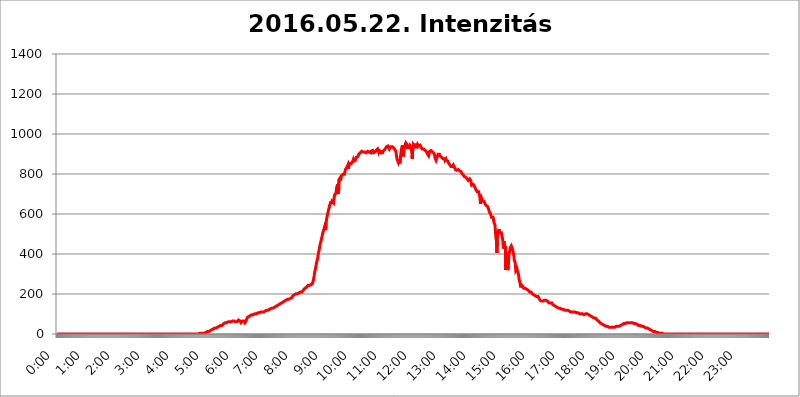
| Category | 2016.05.22. Intenzitás [W/m^2] |
|---|---|
| 0.0 | 0 |
| 0.0006944444444444445 | 0 |
| 0.001388888888888889 | 0 |
| 0.0020833333333333333 | 0 |
| 0.002777777777777778 | 0 |
| 0.003472222222222222 | 0 |
| 0.004166666666666667 | 0 |
| 0.004861111111111111 | 0 |
| 0.005555555555555556 | 0 |
| 0.0062499999999999995 | 0 |
| 0.006944444444444444 | 0 |
| 0.007638888888888889 | 0 |
| 0.008333333333333333 | 0 |
| 0.009027777777777779 | 0 |
| 0.009722222222222222 | 0 |
| 0.010416666666666666 | 0 |
| 0.011111111111111112 | 0 |
| 0.011805555555555555 | 0 |
| 0.012499999999999999 | 0 |
| 0.013194444444444444 | 0 |
| 0.013888888888888888 | 0 |
| 0.014583333333333332 | 0 |
| 0.015277777777777777 | 0 |
| 0.015972222222222224 | 0 |
| 0.016666666666666666 | 0 |
| 0.017361111111111112 | 0 |
| 0.018055555555555557 | 0 |
| 0.01875 | 0 |
| 0.019444444444444445 | 0 |
| 0.02013888888888889 | 0 |
| 0.020833333333333332 | 0 |
| 0.02152777777777778 | 0 |
| 0.022222222222222223 | 0 |
| 0.02291666666666667 | 0 |
| 0.02361111111111111 | 0 |
| 0.024305555555555556 | 0 |
| 0.024999999999999998 | 0 |
| 0.025694444444444447 | 0 |
| 0.02638888888888889 | 0 |
| 0.027083333333333334 | 0 |
| 0.027777777777777776 | 0 |
| 0.02847222222222222 | 0 |
| 0.029166666666666664 | 0 |
| 0.029861111111111113 | 0 |
| 0.030555555555555555 | 0 |
| 0.03125 | 0 |
| 0.03194444444444445 | 0 |
| 0.03263888888888889 | 0 |
| 0.03333333333333333 | 0 |
| 0.034027777777777775 | 0 |
| 0.034722222222222224 | 0 |
| 0.035416666666666666 | 0 |
| 0.036111111111111115 | 0 |
| 0.03680555555555556 | 0 |
| 0.0375 | 0 |
| 0.03819444444444444 | 0 |
| 0.03888888888888889 | 0 |
| 0.03958333333333333 | 0 |
| 0.04027777777777778 | 0 |
| 0.04097222222222222 | 0 |
| 0.041666666666666664 | 0 |
| 0.042361111111111106 | 0 |
| 0.04305555555555556 | 0 |
| 0.043750000000000004 | 0 |
| 0.044444444444444446 | 0 |
| 0.04513888888888889 | 0 |
| 0.04583333333333334 | 0 |
| 0.04652777777777778 | 0 |
| 0.04722222222222222 | 0 |
| 0.04791666666666666 | 0 |
| 0.04861111111111111 | 0 |
| 0.049305555555555554 | 0 |
| 0.049999999999999996 | 0 |
| 0.05069444444444445 | 0 |
| 0.051388888888888894 | 0 |
| 0.052083333333333336 | 0 |
| 0.05277777777777778 | 0 |
| 0.05347222222222222 | 0 |
| 0.05416666666666667 | 0 |
| 0.05486111111111111 | 0 |
| 0.05555555555555555 | 0 |
| 0.05625 | 0 |
| 0.05694444444444444 | 0 |
| 0.057638888888888885 | 0 |
| 0.05833333333333333 | 0 |
| 0.05902777777777778 | 0 |
| 0.059722222222222225 | 0 |
| 0.06041666666666667 | 0 |
| 0.061111111111111116 | 0 |
| 0.06180555555555556 | 0 |
| 0.0625 | 0 |
| 0.06319444444444444 | 0 |
| 0.06388888888888888 | 0 |
| 0.06458333333333334 | 0 |
| 0.06527777777777778 | 0 |
| 0.06597222222222222 | 0 |
| 0.06666666666666667 | 0 |
| 0.06736111111111111 | 0 |
| 0.06805555555555555 | 0 |
| 0.06874999999999999 | 0 |
| 0.06944444444444443 | 0 |
| 0.07013888888888889 | 0 |
| 0.07083333333333333 | 0 |
| 0.07152777777777779 | 0 |
| 0.07222222222222223 | 0 |
| 0.07291666666666667 | 0 |
| 0.07361111111111111 | 0 |
| 0.07430555555555556 | 0 |
| 0.075 | 0 |
| 0.07569444444444444 | 0 |
| 0.0763888888888889 | 0 |
| 0.07708333333333334 | 0 |
| 0.07777777777777778 | 0 |
| 0.07847222222222222 | 0 |
| 0.07916666666666666 | 0 |
| 0.0798611111111111 | 0 |
| 0.08055555555555556 | 0 |
| 0.08125 | 0 |
| 0.08194444444444444 | 0 |
| 0.08263888888888889 | 0 |
| 0.08333333333333333 | 0 |
| 0.08402777777777777 | 0 |
| 0.08472222222222221 | 0 |
| 0.08541666666666665 | 0 |
| 0.08611111111111112 | 0 |
| 0.08680555555555557 | 0 |
| 0.08750000000000001 | 0 |
| 0.08819444444444445 | 0 |
| 0.08888888888888889 | 0 |
| 0.08958333333333333 | 0 |
| 0.09027777777777778 | 0 |
| 0.09097222222222222 | 0 |
| 0.09166666666666667 | 0 |
| 0.09236111111111112 | 0 |
| 0.09305555555555556 | 0 |
| 0.09375 | 0 |
| 0.09444444444444444 | 0 |
| 0.09513888888888888 | 0 |
| 0.09583333333333333 | 0 |
| 0.09652777777777777 | 0 |
| 0.09722222222222222 | 0 |
| 0.09791666666666667 | 0 |
| 0.09861111111111111 | 0 |
| 0.09930555555555555 | 0 |
| 0.09999999999999999 | 0 |
| 0.10069444444444443 | 0 |
| 0.1013888888888889 | 0 |
| 0.10208333333333335 | 0 |
| 0.10277777777777779 | 0 |
| 0.10347222222222223 | 0 |
| 0.10416666666666667 | 0 |
| 0.10486111111111111 | 0 |
| 0.10555555555555556 | 0 |
| 0.10625 | 0 |
| 0.10694444444444444 | 0 |
| 0.1076388888888889 | 0 |
| 0.10833333333333334 | 0 |
| 0.10902777777777778 | 0 |
| 0.10972222222222222 | 0 |
| 0.1111111111111111 | 0 |
| 0.11180555555555556 | 0 |
| 0.11180555555555556 | 0 |
| 0.1125 | 0 |
| 0.11319444444444444 | 0 |
| 0.11388888888888889 | 0 |
| 0.11458333333333333 | 0 |
| 0.11527777777777777 | 0 |
| 0.11597222222222221 | 0 |
| 0.11666666666666665 | 0 |
| 0.1173611111111111 | 0 |
| 0.11805555555555557 | 0 |
| 0.11944444444444445 | 0 |
| 0.12013888888888889 | 0 |
| 0.12083333333333333 | 0 |
| 0.12152777777777778 | 0 |
| 0.12222222222222223 | 0 |
| 0.12291666666666667 | 0 |
| 0.12291666666666667 | 0 |
| 0.12361111111111112 | 0 |
| 0.12430555555555556 | 0 |
| 0.125 | 0 |
| 0.12569444444444444 | 0 |
| 0.12638888888888888 | 0 |
| 0.12708333333333333 | 0 |
| 0.16875 | 0 |
| 0.12847222222222224 | 0 |
| 0.12916666666666668 | 0 |
| 0.12986111111111112 | 0 |
| 0.13055555555555556 | 0 |
| 0.13125 | 0 |
| 0.13194444444444445 | 0 |
| 0.1326388888888889 | 0 |
| 0.13333333333333333 | 0 |
| 0.13402777777777777 | 0 |
| 0.13402777777777777 | 0 |
| 0.13472222222222222 | 0 |
| 0.13541666666666666 | 0 |
| 0.1361111111111111 | 0 |
| 0.13749999999999998 | 0 |
| 0.13819444444444443 | 0 |
| 0.1388888888888889 | 0 |
| 0.13958333333333334 | 0 |
| 0.14027777777777778 | 0 |
| 0.14097222222222222 | 0 |
| 0.14166666666666666 | 0 |
| 0.1423611111111111 | 0 |
| 0.14305555555555557 | 0 |
| 0.14375000000000002 | 0 |
| 0.14444444444444446 | 0 |
| 0.1451388888888889 | 0 |
| 0.1451388888888889 | 0 |
| 0.14652777777777778 | 0 |
| 0.14722222222222223 | 0 |
| 0.14791666666666667 | 0 |
| 0.1486111111111111 | 0 |
| 0.14930555555555555 | 0 |
| 0.15 | 0 |
| 0.15069444444444444 | 0 |
| 0.15138888888888888 | 0 |
| 0.15208333333333332 | 0 |
| 0.15277777777777776 | 0 |
| 0.15347222222222223 | 0 |
| 0.15416666666666667 | 0 |
| 0.15486111111111112 | 0 |
| 0.15555555555555556 | 0 |
| 0.15625 | 0 |
| 0.15694444444444444 | 0 |
| 0.15763888888888888 | 0 |
| 0.15833333333333333 | 0 |
| 0.15902777777777777 | 0 |
| 0.15972222222222224 | 0 |
| 0.16041666666666668 | 0 |
| 0.16111111111111112 | 0 |
| 0.16180555555555556 | 0 |
| 0.1625 | 0 |
| 0.16319444444444445 | 0 |
| 0.1638888888888889 | 0 |
| 0.16458333333333333 | 0 |
| 0.16527777777777777 | 0 |
| 0.16597222222222222 | 0 |
| 0.16666666666666666 | 0 |
| 0.1673611111111111 | 0 |
| 0.16805555555555554 | 0 |
| 0.16874999999999998 | 0 |
| 0.16944444444444443 | 0 |
| 0.17013888888888887 | 0 |
| 0.1708333333333333 | 0 |
| 0.17152777777777775 | 0 |
| 0.17222222222222225 | 0 |
| 0.1729166666666667 | 0 |
| 0.17361111111111113 | 0 |
| 0.17430555555555557 | 0 |
| 0.17500000000000002 | 0 |
| 0.17569444444444446 | 0 |
| 0.1763888888888889 | 0 |
| 0.17708333333333334 | 0 |
| 0.17777777777777778 | 0 |
| 0.17847222222222223 | 0 |
| 0.17916666666666667 | 0 |
| 0.1798611111111111 | 0 |
| 0.18055555555555555 | 0 |
| 0.18125 | 0 |
| 0.18194444444444444 | 0 |
| 0.1826388888888889 | 0 |
| 0.18333333333333335 | 0 |
| 0.1840277777777778 | 0 |
| 0.18472222222222223 | 0 |
| 0.18541666666666667 | 0 |
| 0.18611111111111112 | 0 |
| 0.18680555555555556 | 0 |
| 0.1875 | 0 |
| 0.18819444444444444 | 0 |
| 0.18888888888888888 | 0 |
| 0.18958333333333333 | 0 |
| 0.19027777777777777 | 0 |
| 0.1909722222222222 | 0 |
| 0.19166666666666665 | 0 |
| 0.19236111111111112 | 0 |
| 0.19305555555555554 | 0 |
| 0.19375 | 0 |
| 0.19444444444444445 | 0 |
| 0.1951388888888889 | 0 |
| 0.19583333333333333 | 0 |
| 0.19652777777777777 | 0 |
| 0.19722222222222222 | 0 |
| 0.19791666666666666 | 0 |
| 0.1986111111111111 | 0 |
| 0.19930555555555554 | 0 |
| 0.19999999999999998 | 3.525 |
| 0.20069444444444443 | 3.525 |
| 0.20138888888888887 | 3.525 |
| 0.2020833333333333 | 3.525 |
| 0.2027777777777778 | 3.525 |
| 0.2034722222222222 | 3.525 |
| 0.2041666666666667 | 3.525 |
| 0.20486111111111113 | 3.525 |
| 0.20555555555555557 | 3.525 |
| 0.20625000000000002 | 3.525 |
| 0.20694444444444446 | 7.887 |
| 0.2076388888888889 | 7.887 |
| 0.20833333333333334 | 7.887 |
| 0.20902777777777778 | 7.887 |
| 0.20972222222222223 | 12.257 |
| 0.21041666666666667 | 12.257 |
| 0.2111111111111111 | 12.257 |
| 0.21180555555555555 | 12.257 |
| 0.2125 | 12.257 |
| 0.21319444444444444 | 16.636 |
| 0.2138888888888889 | 16.636 |
| 0.21458333333333335 | 16.636 |
| 0.2152777777777778 | 16.636 |
| 0.21597222222222223 | 21.024 |
| 0.21666666666666667 | 21.024 |
| 0.21736111111111112 | 21.024 |
| 0.21805555555555556 | 21.024 |
| 0.21875 | 25.419 |
| 0.21944444444444444 | 25.419 |
| 0.22013888888888888 | 25.419 |
| 0.22083333333333333 | 29.823 |
| 0.22152777777777777 | 29.823 |
| 0.2222222222222222 | 29.823 |
| 0.22291666666666665 | 29.823 |
| 0.2236111111111111 | 29.823 |
| 0.22430555555555556 | 34.234 |
| 0.225 | 34.234 |
| 0.22569444444444445 | 34.234 |
| 0.2263888888888889 | 38.653 |
| 0.22708333333333333 | 38.653 |
| 0.22777777777777777 | 38.653 |
| 0.22847222222222222 | 38.653 |
| 0.22916666666666666 | 43.079 |
| 0.2298611111111111 | 43.079 |
| 0.23055555555555554 | 43.079 |
| 0.23124999999999998 | 43.079 |
| 0.23194444444444443 | 47.511 |
| 0.23263888888888887 | 47.511 |
| 0.2333333333333333 | 51.951 |
| 0.2340277777777778 | 51.951 |
| 0.2347222222222222 | 51.951 |
| 0.2354166666666667 | 56.398 |
| 0.23611111111111113 | 56.398 |
| 0.23680555555555557 | 56.398 |
| 0.23750000000000002 | 56.398 |
| 0.23819444444444446 | 56.398 |
| 0.2388888888888889 | 60.85 |
| 0.23958333333333334 | 60.85 |
| 0.24027777777777778 | 60.85 |
| 0.24097222222222223 | 60.85 |
| 0.24166666666666667 | 60.85 |
| 0.2423611111111111 | 60.85 |
| 0.24305555555555555 | 60.85 |
| 0.24375 | 60.85 |
| 0.24444444444444446 | 65.31 |
| 0.24513888888888888 | 65.31 |
| 0.24583333333333335 | 65.31 |
| 0.2465277777777778 | 65.31 |
| 0.24722222222222223 | 65.31 |
| 0.24791666666666667 | 65.31 |
| 0.24861111111111112 | 60.85 |
| 0.24930555555555556 | 60.85 |
| 0.25 | 60.85 |
| 0.25069444444444444 | 60.85 |
| 0.2513888888888889 | 60.85 |
| 0.2520833333333333 | 60.85 |
| 0.25277777777777777 | 56.398 |
| 0.2534722222222222 | 65.31 |
| 0.25416666666666665 | 69.775 |
| 0.2548611111111111 | 69.775 |
| 0.2555555555555556 | 69.775 |
| 0.25625000000000003 | 65.31 |
| 0.2569444444444445 | 65.31 |
| 0.2576388888888889 | 56.398 |
| 0.25833333333333336 | 60.85 |
| 0.2590277777777778 | 60.85 |
| 0.25972222222222224 | 65.31 |
| 0.2604166666666667 | 60.85 |
| 0.2611111111111111 | 65.31 |
| 0.26180555555555557 | 65.31 |
| 0.2625 | 60.85 |
| 0.26319444444444445 | 56.398 |
| 0.2638888888888889 | 56.398 |
| 0.26458333333333334 | 60.85 |
| 0.2652777777777778 | 69.775 |
| 0.2659722222222222 | 74.246 |
| 0.26666666666666666 | 83.205 |
| 0.2673611111111111 | 83.205 |
| 0.26805555555555555 | 87.692 |
| 0.26875 | 87.692 |
| 0.26944444444444443 | 87.692 |
| 0.2701388888888889 | 92.184 |
| 0.2708333333333333 | 92.184 |
| 0.27152777777777776 | 92.184 |
| 0.2722222222222222 | 92.184 |
| 0.27291666666666664 | 96.682 |
| 0.2736111111111111 | 96.682 |
| 0.2743055555555555 | 96.682 |
| 0.27499999999999997 | 96.682 |
| 0.27569444444444446 | 101.184 |
| 0.27638888888888885 | 101.184 |
| 0.27708333333333335 | 101.184 |
| 0.2777777777777778 | 101.184 |
| 0.27847222222222223 | 101.184 |
| 0.2791666666666667 | 101.184 |
| 0.2798611111111111 | 105.69 |
| 0.28055555555555556 | 105.69 |
| 0.28125 | 105.69 |
| 0.28194444444444444 | 105.69 |
| 0.2826388888888889 | 105.69 |
| 0.2833333333333333 | 105.69 |
| 0.28402777777777777 | 110.201 |
| 0.2847222222222222 | 110.201 |
| 0.28541666666666665 | 110.201 |
| 0.28611111111111115 | 110.201 |
| 0.28680555555555554 | 110.201 |
| 0.28750000000000003 | 110.201 |
| 0.2881944444444445 | 110.201 |
| 0.2888888888888889 | 110.201 |
| 0.28958333333333336 | 110.201 |
| 0.2902777777777778 | 114.716 |
| 0.29097222222222224 | 114.716 |
| 0.2916666666666667 | 114.716 |
| 0.2923611111111111 | 114.716 |
| 0.29305555555555557 | 119.235 |
| 0.29375 | 119.235 |
| 0.29444444444444445 | 119.235 |
| 0.2951388888888889 | 119.235 |
| 0.29583333333333334 | 119.235 |
| 0.2965277777777778 | 119.235 |
| 0.2972222222222222 | 119.235 |
| 0.29791666666666666 | 123.758 |
| 0.2986111111111111 | 123.758 |
| 0.29930555555555555 | 123.758 |
| 0.3 | 128.284 |
| 0.30069444444444443 | 128.284 |
| 0.3013888888888889 | 128.284 |
| 0.3020833333333333 | 128.284 |
| 0.30277777777777776 | 128.284 |
| 0.3034722222222222 | 132.814 |
| 0.30416666666666664 | 132.814 |
| 0.3048611111111111 | 132.814 |
| 0.3055555555555555 | 137.347 |
| 0.30624999999999997 | 137.347 |
| 0.3069444444444444 | 141.884 |
| 0.3076388888888889 | 141.884 |
| 0.30833333333333335 | 141.884 |
| 0.3090277777777778 | 146.423 |
| 0.30972222222222223 | 146.423 |
| 0.3104166666666667 | 146.423 |
| 0.3111111111111111 | 150.964 |
| 0.31180555555555556 | 150.964 |
| 0.3125 | 150.964 |
| 0.31319444444444444 | 155.509 |
| 0.3138888888888889 | 155.509 |
| 0.3145833333333333 | 155.509 |
| 0.31527777777777777 | 155.509 |
| 0.3159722222222222 | 160.056 |
| 0.31666666666666665 | 160.056 |
| 0.31736111111111115 | 164.605 |
| 0.31805555555555554 | 164.605 |
| 0.31875000000000003 | 164.605 |
| 0.3194444444444445 | 164.605 |
| 0.3201388888888889 | 164.605 |
| 0.32083333333333336 | 169.156 |
| 0.3215277777777778 | 169.156 |
| 0.32222222222222224 | 173.709 |
| 0.3229166666666667 | 173.709 |
| 0.3236111111111111 | 173.709 |
| 0.32430555555555557 | 173.709 |
| 0.325 | 173.709 |
| 0.32569444444444445 | 178.264 |
| 0.3263888888888889 | 178.264 |
| 0.32708333333333334 | 178.264 |
| 0.3277777777777778 | 182.82 |
| 0.3284722222222222 | 182.82 |
| 0.32916666666666666 | 182.82 |
| 0.3298611111111111 | 187.378 |
| 0.33055555555555555 | 191.937 |
| 0.33125 | 191.937 |
| 0.33194444444444443 | 196.497 |
| 0.3326388888888889 | 196.497 |
| 0.3333333333333333 | 201.058 |
| 0.3340277777777778 | 201.058 |
| 0.3347222222222222 | 201.058 |
| 0.3354166666666667 | 201.058 |
| 0.3361111111111111 | 205.62 |
| 0.3368055555555556 | 201.058 |
| 0.33749999999999997 | 205.62 |
| 0.33819444444444446 | 205.62 |
| 0.33888888888888885 | 205.62 |
| 0.33958333333333335 | 210.182 |
| 0.34027777777777773 | 210.182 |
| 0.34097222222222223 | 210.182 |
| 0.3416666666666666 | 210.182 |
| 0.3423611111111111 | 210.182 |
| 0.3430555555555555 | 210.182 |
| 0.34375 | 210.182 |
| 0.3444444444444445 | 214.746 |
| 0.3451388888888889 | 219.309 |
| 0.3458333333333334 | 223.873 |
| 0.34652777777777777 | 223.873 |
| 0.34722222222222227 | 228.436 |
| 0.34791666666666665 | 228.436 |
| 0.34861111111111115 | 233 |
| 0.34930555555555554 | 233 |
| 0.35000000000000003 | 237.564 |
| 0.3506944444444444 | 237.564 |
| 0.3513888888888889 | 242.127 |
| 0.3520833333333333 | 242.127 |
| 0.3527777777777778 | 242.127 |
| 0.3534722222222222 | 242.127 |
| 0.3541666666666667 | 246.689 |
| 0.3548611111111111 | 246.689 |
| 0.35555555555555557 | 246.689 |
| 0.35625 | 246.689 |
| 0.35694444444444445 | 251.251 |
| 0.3576388888888889 | 251.251 |
| 0.35833333333333334 | 255.813 |
| 0.3590277777777778 | 264.932 |
| 0.3597222222222222 | 278.603 |
| 0.36041666666666666 | 292.259 |
| 0.3611111111111111 | 310.44 |
| 0.36180555555555555 | 319.517 |
| 0.3625 | 333.113 |
| 0.36319444444444443 | 346.682 |
| 0.3638888888888889 | 360.221 |
| 0.3645833333333333 | 369.23 |
| 0.3652777777777778 | 378.224 |
| 0.3659722222222222 | 396.164 |
| 0.3666666666666667 | 409.574 |
| 0.3673611111111111 | 422.943 |
| 0.3680555555555556 | 436.27 |
| 0.36874999999999997 | 449.551 |
| 0.36944444444444446 | 458.38 |
| 0.37013888888888885 | 467.187 |
| 0.37083333333333335 | 480.356 |
| 0.37152777777777773 | 489.108 |
| 0.37222222222222223 | 502.192 |
| 0.3729166666666666 | 510.885 |
| 0.3736111111111111 | 519.555 |
| 0.3743055555555555 | 523.88 |
| 0.375 | 536.82 |
| 0.3756944444444445 | 528.2 |
| 0.3763888888888889 | 519.555 |
| 0.3770833333333334 | 553.986 |
| 0.37777777777777777 | 575.299 |
| 0.37847222222222227 | 588.009 |
| 0.37916666666666665 | 600.661 |
| 0.37986111111111115 | 609.062 |
| 0.38055555555555554 | 621.613 |
| 0.38125000000000003 | 629.948 |
| 0.3819444444444444 | 642.4 |
| 0.3826388888888889 | 646.537 |
| 0.3833333333333333 | 654.791 |
| 0.3840277777777778 | 663.019 |
| 0.3847222222222222 | 650.667 |
| 0.3854166666666667 | 663.019 |
| 0.3861111111111111 | 658.909 |
| 0.38680555555555557 | 658.909 |
| 0.3875 | 654.791 |
| 0.38819444444444445 | 675.311 |
| 0.3888888888888889 | 695.666 |
| 0.38958333333333334 | 691.608 |
| 0.3902777777777778 | 695.666 |
| 0.3909722222222222 | 703.762 |
| 0.39166666666666666 | 727.896 |
| 0.3923611111111111 | 727.896 |
| 0.39305555555555555 | 747.834 |
| 0.39375 | 747.834 |
| 0.39444444444444443 | 699.717 |
| 0.3951388888888889 | 771.559 |
| 0.3958333333333333 | 767.62 |
| 0.3965277777777778 | 779.42 |
| 0.3972222222222222 | 767.62 |
| 0.3979166666666667 | 779.42 |
| 0.3986111111111111 | 791.169 |
| 0.3993055555555556 | 791.169 |
| 0.39999999999999997 | 795.074 |
| 0.40069444444444446 | 798.974 |
| 0.40138888888888885 | 802.868 |
| 0.40208333333333335 | 802.868 |
| 0.40277777777777773 | 798.974 |
| 0.40347222222222223 | 810.641 |
| 0.4041666666666666 | 822.26 |
| 0.4048611111111111 | 822.26 |
| 0.4055555555555555 | 818.392 |
| 0.40625 | 833.834 |
| 0.4069444444444445 | 833.834 |
| 0.4076388888888889 | 845.365 |
| 0.4083333333333334 | 826.123 |
| 0.40902777777777777 | 845.365 |
| 0.40972222222222227 | 845.365 |
| 0.41041666666666665 | 853.029 |
| 0.41111111111111115 | 856.855 |
| 0.41180555555555554 | 853.029 |
| 0.41250000000000003 | 853.029 |
| 0.4131944444444444 | 853.029 |
| 0.4138888888888889 | 856.855 |
| 0.4145833333333333 | 864.493 |
| 0.4152777777777778 | 872.114 |
| 0.4159722222222222 | 864.493 |
| 0.4166666666666667 | 864.493 |
| 0.4173611111111111 | 864.493 |
| 0.41805555555555557 | 868.305 |
| 0.41875 | 875.918 |
| 0.41944444444444445 | 883.516 |
| 0.4201388888888889 | 879.719 |
| 0.42083333333333334 | 887.309 |
| 0.4215277777777778 | 887.309 |
| 0.4222222222222222 | 891.099 |
| 0.42291666666666666 | 898.668 |
| 0.4236111111111111 | 898.668 |
| 0.42430555555555555 | 898.668 |
| 0.425 | 906.223 |
| 0.42569444444444443 | 906.223 |
| 0.4263888888888889 | 909.996 |
| 0.4270833333333333 | 913.766 |
| 0.4277777777777778 | 909.996 |
| 0.4284722222222222 | 909.996 |
| 0.4291666666666667 | 909.996 |
| 0.4298611111111111 | 909.996 |
| 0.4305555555555556 | 909.996 |
| 0.43124999999999997 | 909.996 |
| 0.43194444444444446 | 906.223 |
| 0.43263888888888885 | 909.996 |
| 0.43333333333333335 | 906.223 |
| 0.43402777777777773 | 909.996 |
| 0.43472222222222223 | 906.223 |
| 0.4354166666666666 | 913.766 |
| 0.4361111111111111 | 913.766 |
| 0.4368055555555555 | 909.996 |
| 0.4375 | 909.996 |
| 0.4381944444444445 | 906.223 |
| 0.4388888888888889 | 906.223 |
| 0.4395833333333334 | 906.223 |
| 0.44027777777777777 | 913.766 |
| 0.44097222222222227 | 917.534 |
| 0.44166666666666665 | 917.534 |
| 0.44236111111111115 | 917.534 |
| 0.44305555555555554 | 917.534 |
| 0.44375000000000003 | 906.223 |
| 0.4444444444444444 | 902.447 |
| 0.4451388888888889 | 909.996 |
| 0.4458333333333333 | 909.996 |
| 0.4465277777777778 | 913.766 |
| 0.4472222222222222 | 917.534 |
| 0.4479166666666667 | 917.534 |
| 0.4486111111111111 | 917.534 |
| 0.44930555555555557 | 925.06 |
| 0.45 | 917.534 |
| 0.45069444444444445 | 909.996 |
| 0.4513888888888889 | 917.534 |
| 0.45208333333333334 | 921.298 |
| 0.4527777777777778 | 921.298 |
| 0.4534722222222222 | 913.766 |
| 0.45416666666666666 | 906.223 |
| 0.4548611111111111 | 902.447 |
| 0.45555555555555555 | 902.447 |
| 0.45625 | 906.223 |
| 0.45694444444444443 | 913.766 |
| 0.4576388888888889 | 909.996 |
| 0.4583333333333333 | 917.534 |
| 0.4590277777777778 | 921.298 |
| 0.4597222222222222 | 925.06 |
| 0.4604166666666667 | 928.819 |
| 0.4611111111111111 | 932.576 |
| 0.4618055555555556 | 936.33 |
| 0.46249999999999997 | 940.082 |
| 0.46319444444444446 | 940.082 |
| 0.46388888888888885 | 940.082 |
| 0.46458333333333335 | 943.832 |
| 0.46527777777777773 | 932.576 |
| 0.46597222222222223 | 925.06 |
| 0.4666666666666666 | 925.06 |
| 0.4673611111111111 | 928.819 |
| 0.4680555555555555 | 936.33 |
| 0.46875 | 940.082 |
| 0.4694444444444445 | 940.082 |
| 0.4701388888888889 | 936.33 |
| 0.4708333333333334 | 932.576 |
| 0.47152777777777777 | 940.082 |
| 0.47222222222222227 | 928.819 |
| 0.47291666666666665 | 925.06 |
| 0.47361111111111115 | 925.06 |
| 0.47430555555555554 | 917.534 |
| 0.47500000000000003 | 909.996 |
| 0.4756944444444444 | 894.885 |
| 0.4763888888888889 | 875.918 |
| 0.4770833333333333 | 879.719 |
| 0.4777777777777778 | 875.918 |
| 0.4784722222222222 | 856.855 |
| 0.4791666666666667 | 856.855 |
| 0.4798611111111111 | 872.114 |
| 0.48055555555555557 | 853.029 |
| 0.48125 | 879.719 |
| 0.48194444444444445 | 902.447 |
| 0.4826388888888889 | 921.298 |
| 0.48333333333333334 | 932.576 |
| 0.4840277777777778 | 943.832 |
| 0.4847222222222222 | 921.298 |
| 0.48541666666666666 | 887.309 |
| 0.4861111111111111 | 909.996 |
| 0.48680555555555555 | 932.576 |
| 0.4875 | 940.082 |
| 0.48819444444444443 | 940.082 |
| 0.4888888888888889 | 955.071 |
| 0.4895833333333333 | 958.814 |
| 0.4902777777777778 | 947.58 |
| 0.4909722222222222 | 932.576 |
| 0.4916666666666667 | 932.576 |
| 0.4923611111111111 | 932.576 |
| 0.4930555555555556 | 932.576 |
| 0.49374999999999997 | 936.33 |
| 0.49444444444444446 | 943.832 |
| 0.49513888888888885 | 940.082 |
| 0.49583333333333335 | 936.33 |
| 0.49652777777777773 | 932.576 |
| 0.49722222222222223 | 909.996 |
| 0.4979166666666666 | 875.918 |
| 0.4986111111111111 | 928.819 |
| 0.4993055555555555 | 947.58 |
| 0.5 | 943.832 |
| 0.5006944444444444 | 940.082 |
| 0.5013888888888889 | 928.819 |
| 0.5020833333333333 | 951.327 |
| 0.5027777777777778 | 943.832 |
| 0.5034722222222222 | 947.58 |
| 0.5041666666666667 | 943.832 |
| 0.5048611111111111 | 936.33 |
| 0.5055555555555555 | 947.58 |
| 0.50625 | 947.58 |
| 0.5069444444444444 | 940.082 |
| 0.5076388888888889 | 943.832 |
| 0.5083333333333333 | 943.832 |
| 0.5090277777777777 | 943.832 |
| 0.5097222222222222 | 940.082 |
| 0.5104166666666666 | 932.576 |
| 0.5111111111111112 | 936.33 |
| 0.5118055555555555 | 925.06 |
| 0.5125000000000001 | 921.298 |
| 0.5131944444444444 | 928.819 |
| 0.513888888888889 | 925.06 |
| 0.5145833333333333 | 925.06 |
| 0.5152777777777778 | 925.06 |
| 0.5159722222222222 | 917.534 |
| 0.5166666666666667 | 917.534 |
| 0.517361111111111 | 917.534 |
| 0.5180555555555556 | 909.996 |
| 0.5187499999999999 | 906.223 |
| 0.5194444444444445 | 898.668 |
| 0.5201388888888888 | 894.885 |
| 0.5208333333333334 | 891.099 |
| 0.5215277777777778 | 902.447 |
| 0.5222222222222223 | 913.766 |
| 0.5229166666666667 | 917.534 |
| 0.5236111111111111 | 917.534 |
| 0.5243055555555556 | 917.534 |
| 0.525 | 917.534 |
| 0.5256944444444445 | 921.298 |
| 0.5263888888888889 | 909.996 |
| 0.5270833333333333 | 909.996 |
| 0.5277777777777778 | 906.223 |
| 0.5284722222222222 | 902.447 |
| 0.5291666666666667 | 894.885 |
| 0.5298611111111111 | 879.719 |
| 0.5305555555555556 | 883.516 |
| 0.53125 | 868.305 |
| 0.5319444444444444 | 868.305 |
| 0.5326388888888889 | 868.305 |
| 0.5333333333333333 | 891.099 |
| 0.5340277777777778 | 898.668 |
| 0.5347222222222222 | 894.885 |
| 0.5354166666666667 | 894.885 |
| 0.5361111111111111 | 898.668 |
| 0.5368055555555555 | 891.099 |
| 0.5375 | 887.309 |
| 0.5381944444444444 | 887.309 |
| 0.5388888888888889 | 883.516 |
| 0.5395833333333333 | 879.719 |
| 0.5402777777777777 | 883.516 |
| 0.5409722222222222 | 875.918 |
| 0.5416666666666666 | 872.114 |
| 0.5423611111111112 | 872.114 |
| 0.5430555555555555 | 875.918 |
| 0.5437500000000001 | 868.305 |
| 0.5444444444444444 | 868.305 |
| 0.545138888888889 | 875.918 |
| 0.5458333333333333 | 868.305 |
| 0.5465277777777778 | 868.305 |
| 0.5472222222222222 | 868.305 |
| 0.5479166666666667 | 864.493 |
| 0.548611111111111 | 856.855 |
| 0.5493055555555556 | 853.029 |
| 0.5499999999999999 | 849.199 |
| 0.5506944444444445 | 849.199 |
| 0.5513888888888888 | 849.199 |
| 0.5520833333333334 | 837.682 |
| 0.5527777777777778 | 833.834 |
| 0.5534722222222223 | 837.682 |
| 0.5541666666666667 | 837.682 |
| 0.5548611111111111 | 841.526 |
| 0.5555555555555556 | 845.365 |
| 0.55625 | 845.365 |
| 0.5569444444444445 | 841.526 |
| 0.5576388888888889 | 829.981 |
| 0.5583333333333333 | 822.26 |
| 0.5590277777777778 | 822.26 |
| 0.5597222222222222 | 826.123 |
| 0.5604166666666667 | 818.392 |
| 0.5611111111111111 | 818.392 |
| 0.5618055555555556 | 818.392 |
| 0.5625 | 822.26 |
| 0.5631944444444444 | 826.123 |
| 0.5638888888888889 | 818.392 |
| 0.5645833333333333 | 814.519 |
| 0.5652777777777778 | 814.519 |
| 0.5659722222222222 | 810.641 |
| 0.5666666666666667 | 810.641 |
| 0.5673611111111111 | 802.868 |
| 0.5680555555555555 | 806.757 |
| 0.56875 | 798.974 |
| 0.5694444444444444 | 795.074 |
| 0.5701388888888889 | 798.974 |
| 0.5708333333333333 | 787.258 |
| 0.5715277777777777 | 791.169 |
| 0.5722222222222222 | 787.258 |
| 0.5729166666666666 | 783.342 |
| 0.5736111111111112 | 783.342 |
| 0.5743055555555555 | 779.42 |
| 0.5750000000000001 | 775.492 |
| 0.5756944444444444 | 771.559 |
| 0.576388888888889 | 767.62 |
| 0.5770833333333333 | 767.62 |
| 0.5777777777777778 | 767.62 |
| 0.5784722222222222 | 775.492 |
| 0.5791666666666667 | 771.559 |
| 0.579861111111111 | 767.62 |
| 0.5805555555555556 | 755.766 |
| 0.5812499999999999 | 743.859 |
| 0.5819444444444445 | 743.859 |
| 0.5826388888888888 | 747.834 |
| 0.5833333333333334 | 747.834 |
| 0.5840277777777778 | 743.859 |
| 0.5847222222222223 | 739.877 |
| 0.5854166666666667 | 739.877 |
| 0.5861111111111111 | 731.896 |
| 0.5868055555555556 | 723.889 |
| 0.5875 | 727.896 |
| 0.5881944444444445 | 719.877 |
| 0.5888888888888889 | 711.832 |
| 0.5895833333333333 | 711.832 |
| 0.5902777777777778 | 715.858 |
| 0.5909722222222222 | 711.832 |
| 0.5916666666666667 | 699.717 |
| 0.5923611111111111 | 691.608 |
| 0.5930555555555556 | 687.544 |
| 0.59375 | 650.667 |
| 0.5944444444444444 | 667.123 |
| 0.5951388888888889 | 679.395 |
| 0.5958333333333333 | 675.311 |
| 0.5965277777777778 | 667.123 |
| 0.5972222222222222 | 667.123 |
| 0.5979166666666667 | 667.123 |
| 0.5986111111111111 | 663.019 |
| 0.5993055555555555 | 658.909 |
| 0.6 | 650.667 |
| 0.6006944444444444 | 646.537 |
| 0.6013888888888889 | 642.4 |
| 0.6020833333333333 | 642.4 |
| 0.6027777777777777 | 642.4 |
| 0.6034722222222222 | 638.256 |
| 0.6041666666666666 | 634.105 |
| 0.6048611111111112 | 625.784 |
| 0.6055555555555555 | 621.613 |
| 0.6062500000000001 | 609.062 |
| 0.6069444444444444 | 609.062 |
| 0.607638888888889 | 600.661 |
| 0.6083333333333333 | 596.45 |
| 0.6090277777777778 | 583.779 |
| 0.6097222222222222 | 588.009 |
| 0.6104166666666667 | 583.779 |
| 0.611111111111111 | 583.779 |
| 0.6118055555555556 | 575.299 |
| 0.6124999999999999 | 558.261 |
| 0.6131944444444445 | 553.986 |
| 0.6138888888888888 | 545.416 |
| 0.6145833333333334 | 541.121 |
| 0.6152777777777778 | 480.356 |
| 0.6159722222222223 | 467.187 |
| 0.6166666666666667 | 405.108 |
| 0.6173611111111111 | 493.475 |
| 0.6180555555555556 | 502.192 |
| 0.61875 | 510.885 |
| 0.6194444444444445 | 523.88 |
| 0.6201388888888889 | 515.223 |
| 0.6208333333333333 | 506.542 |
| 0.6215277777777778 | 506.542 |
| 0.6222222222222222 | 510.885 |
| 0.6229166666666667 | 506.542 |
| 0.6236111111111111 | 502.192 |
| 0.6243055555555556 | 480.356 |
| 0.625 | 462.786 |
| 0.6256944444444444 | 427.39 |
| 0.6263888888888889 | 462.786 |
| 0.6270833333333333 | 453.968 |
| 0.6277777777777778 | 431.833 |
| 0.6284722222222222 | 440.702 |
| 0.6291666666666667 | 319.517 |
| 0.6298611111111111 | 409.574 |
| 0.6305555555555555 | 387.202 |
| 0.63125 | 369.23 |
| 0.6319444444444444 | 319.517 |
| 0.6326388888888889 | 337.639 |
| 0.6333333333333333 | 396.164 |
| 0.6340277777777777 | 405.108 |
| 0.6347222222222222 | 409.574 |
| 0.6354166666666666 | 431.833 |
| 0.6361111111111112 | 436.27 |
| 0.6368055555555555 | 440.702 |
| 0.6375000000000001 | 436.27 |
| 0.6381944444444444 | 427.39 |
| 0.638888888888889 | 418.492 |
| 0.6395833333333333 | 405.108 |
| 0.6402777777777778 | 396.164 |
| 0.6409722222222222 | 369.23 |
| 0.6416666666666667 | 364.728 |
| 0.642361111111111 | 355.712 |
| 0.6430555555555556 | 319.517 |
| 0.6437499999999999 | 324.052 |
| 0.6444444444444445 | 328.584 |
| 0.6451388888888888 | 319.517 |
| 0.6458333333333334 | 310.44 |
| 0.6465277777777778 | 301.354 |
| 0.6472222222222223 | 292.259 |
| 0.6479166666666667 | 269.49 |
| 0.6486111111111111 | 274.047 |
| 0.6493055555555556 | 251.251 |
| 0.65 | 233 |
| 0.6506944444444445 | 246.689 |
| 0.6513888888888889 | 242.127 |
| 0.6520833333333333 | 242.127 |
| 0.6527777777777778 | 237.564 |
| 0.6534722222222222 | 233 |
| 0.6541666666666667 | 228.436 |
| 0.6548611111111111 | 228.436 |
| 0.6555555555555556 | 228.436 |
| 0.65625 | 228.436 |
| 0.6569444444444444 | 228.436 |
| 0.6576388888888889 | 228.436 |
| 0.6583333333333333 | 223.873 |
| 0.6590277777777778 | 223.873 |
| 0.6597222222222222 | 219.309 |
| 0.6604166666666667 | 219.309 |
| 0.6611111111111111 | 214.746 |
| 0.6618055555555555 | 214.746 |
| 0.6625 | 210.182 |
| 0.6631944444444444 | 210.182 |
| 0.6638888888888889 | 210.182 |
| 0.6645833333333333 | 210.182 |
| 0.6652777777777777 | 205.62 |
| 0.6659722222222222 | 201.058 |
| 0.6666666666666666 | 201.058 |
| 0.6673611111111111 | 201.058 |
| 0.6680555555555556 | 196.497 |
| 0.6687500000000001 | 196.497 |
| 0.6694444444444444 | 191.937 |
| 0.6701388888888888 | 191.937 |
| 0.6708333333333334 | 191.937 |
| 0.6715277777777778 | 191.937 |
| 0.6722222222222222 | 187.378 |
| 0.6729166666666666 | 187.378 |
| 0.6736111111111112 | 187.378 |
| 0.6743055555555556 | 187.378 |
| 0.6749999999999999 | 182.82 |
| 0.6756944444444444 | 178.264 |
| 0.6763888888888889 | 173.709 |
| 0.6770833333333334 | 169.156 |
| 0.6777777777777777 | 169.156 |
| 0.6784722222222223 | 164.605 |
| 0.6791666666666667 | 164.605 |
| 0.6798611111111111 | 164.605 |
| 0.6805555555555555 | 164.605 |
| 0.68125 | 164.605 |
| 0.6819444444444445 | 164.605 |
| 0.6826388888888889 | 169.156 |
| 0.6833333333333332 | 169.156 |
| 0.6840277777777778 | 169.156 |
| 0.6847222222222222 | 169.156 |
| 0.6854166666666667 | 169.156 |
| 0.686111111111111 | 169.156 |
| 0.6868055555555556 | 169.156 |
| 0.6875 | 164.605 |
| 0.6881944444444444 | 164.605 |
| 0.688888888888889 | 160.056 |
| 0.6895833333333333 | 155.509 |
| 0.6902777777777778 | 155.509 |
| 0.6909722222222222 | 155.509 |
| 0.6916666666666668 | 155.509 |
| 0.6923611111111111 | 155.509 |
| 0.6930555555555555 | 155.509 |
| 0.69375 | 155.509 |
| 0.6944444444444445 | 150.964 |
| 0.6951388888888889 | 146.423 |
| 0.6958333333333333 | 146.423 |
| 0.6965277777777777 | 141.884 |
| 0.6972222222222223 | 141.884 |
| 0.6979166666666666 | 137.347 |
| 0.6986111111111111 | 137.347 |
| 0.6993055555555556 | 137.347 |
| 0.7000000000000001 | 137.347 |
| 0.7006944444444444 | 137.347 |
| 0.7013888888888888 | 132.814 |
| 0.7020833333333334 | 132.814 |
| 0.7027777777777778 | 132.814 |
| 0.7034722222222222 | 128.284 |
| 0.7041666666666666 | 128.284 |
| 0.7048611111111112 | 128.284 |
| 0.7055555555555556 | 128.284 |
| 0.7062499999999999 | 128.284 |
| 0.7069444444444444 | 123.758 |
| 0.7076388888888889 | 123.758 |
| 0.7083333333333334 | 123.758 |
| 0.7090277777777777 | 123.758 |
| 0.7097222222222223 | 123.758 |
| 0.7104166666666667 | 119.235 |
| 0.7111111111111111 | 119.235 |
| 0.7118055555555555 | 119.235 |
| 0.7125 | 119.235 |
| 0.7131944444444445 | 119.235 |
| 0.7138888888888889 | 119.235 |
| 0.7145833333333332 | 119.235 |
| 0.7152777777777778 | 119.235 |
| 0.7159722222222222 | 119.235 |
| 0.7166666666666667 | 114.716 |
| 0.717361111111111 | 114.716 |
| 0.7180555555555556 | 114.716 |
| 0.71875 | 114.716 |
| 0.7194444444444444 | 114.716 |
| 0.720138888888889 | 110.201 |
| 0.7208333333333333 | 110.201 |
| 0.7215277777777778 | 110.201 |
| 0.7222222222222222 | 110.201 |
| 0.7229166666666668 | 110.201 |
| 0.7236111111111111 | 110.201 |
| 0.7243055555555555 | 110.201 |
| 0.725 | 110.201 |
| 0.7256944444444445 | 110.201 |
| 0.7263888888888889 | 110.201 |
| 0.7270833333333333 | 105.69 |
| 0.7277777777777777 | 105.69 |
| 0.7284722222222223 | 105.69 |
| 0.7291666666666666 | 105.69 |
| 0.7298611111111111 | 105.69 |
| 0.7305555555555556 | 105.69 |
| 0.7312500000000001 | 105.69 |
| 0.7319444444444444 | 105.69 |
| 0.7326388888888888 | 101.184 |
| 0.7333333333333334 | 101.184 |
| 0.7340277777777778 | 101.184 |
| 0.7347222222222222 | 101.184 |
| 0.7354166666666666 | 101.184 |
| 0.7361111111111112 | 101.184 |
| 0.7368055555555556 | 101.184 |
| 0.7374999999999999 | 101.184 |
| 0.7381944444444444 | 101.184 |
| 0.7388888888888889 | 96.682 |
| 0.7395833333333334 | 96.682 |
| 0.7402777777777777 | 96.682 |
| 0.7409722222222223 | 101.184 |
| 0.7416666666666667 | 101.184 |
| 0.7423611111111111 | 101.184 |
| 0.7430555555555555 | 101.184 |
| 0.74375 | 101.184 |
| 0.7444444444444445 | 96.682 |
| 0.7451388888888889 | 96.682 |
| 0.7458333333333332 | 96.682 |
| 0.7465277777777778 | 96.682 |
| 0.7472222222222222 | 92.184 |
| 0.7479166666666667 | 92.184 |
| 0.748611111111111 | 92.184 |
| 0.7493055555555556 | 87.692 |
| 0.75 | 83.205 |
| 0.7506944444444444 | 83.205 |
| 0.751388888888889 | 83.205 |
| 0.7520833333333333 | 83.205 |
| 0.7527777777777778 | 83.205 |
| 0.7534722222222222 | 78.722 |
| 0.7541666666666668 | 78.722 |
| 0.7548611111111111 | 78.722 |
| 0.7555555555555555 | 78.722 |
| 0.75625 | 74.246 |
| 0.7569444444444445 | 69.775 |
| 0.7576388888888889 | 69.775 |
| 0.7583333333333333 | 65.31 |
| 0.7590277777777777 | 65.31 |
| 0.7597222222222223 | 60.85 |
| 0.7604166666666666 | 60.85 |
| 0.7611111111111111 | 56.398 |
| 0.7618055555555556 | 56.398 |
| 0.7625000000000001 | 51.951 |
| 0.7631944444444444 | 51.951 |
| 0.7638888888888888 | 47.511 |
| 0.7645833333333334 | 47.511 |
| 0.7652777777777778 | 47.511 |
| 0.7659722222222222 | 43.079 |
| 0.7666666666666666 | 43.079 |
| 0.7673611111111112 | 43.079 |
| 0.7680555555555556 | 43.079 |
| 0.7687499999999999 | 38.653 |
| 0.7694444444444444 | 38.653 |
| 0.7701388888888889 | 38.653 |
| 0.7708333333333334 | 38.653 |
| 0.7715277777777777 | 38.653 |
| 0.7722222222222223 | 38.653 |
| 0.7729166666666667 | 34.234 |
| 0.7736111111111111 | 34.234 |
| 0.7743055555555555 | 34.234 |
| 0.775 | 34.234 |
| 0.7756944444444445 | 34.234 |
| 0.7763888888888889 | 34.234 |
| 0.7770833333333332 | 34.234 |
| 0.7777777777777778 | 34.234 |
| 0.7784722222222222 | 34.234 |
| 0.7791666666666667 | 34.234 |
| 0.779861111111111 | 34.234 |
| 0.7805555555555556 | 34.234 |
| 0.78125 | 34.234 |
| 0.7819444444444444 | 34.234 |
| 0.782638888888889 | 34.234 |
| 0.7833333333333333 | 34.234 |
| 0.7840277777777778 | 38.653 |
| 0.7847222222222222 | 38.653 |
| 0.7854166666666668 | 38.653 |
| 0.7861111111111111 | 38.653 |
| 0.7868055555555555 | 38.653 |
| 0.7875 | 38.653 |
| 0.7881944444444445 | 38.653 |
| 0.7888888888888889 | 38.653 |
| 0.7895833333333333 | 43.079 |
| 0.7902777777777777 | 43.079 |
| 0.7909722222222223 | 43.079 |
| 0.7916666666666666 | 47.511 |
| 0.7923611111111111 | 47.511 |
| 0.7930555555555556 | 47.511 |
| 0.7937500000000001 | 47.511 |
| 0.7944444444444444 | 51.951 |
| 0.7951388888888888 | 51.951 |
| 0.7958333333333334 | 51.951 |
| 0.7965277777777778 | 51.951 |
| 0.7972222222222222 | 56.398 |
| 0.7979166666666666 | 56.398 |
| 0.7986111111111112 | 56.398 |
| 0.7993055555555556 | 56.398 |
| 0.7999999999999999 | 56.398 |
| 0.8006944444444444 | 56.398 |
| 0.8013888888888889 | 56.398 |
| 0.8020833333333334 | 56.398 |
| 0.8027777777777777 | 56.398 |
| 0.8034722222222223 | 56.398 |
| 0.8041666666666667 | 56.398 |
| 0.8048611111111111 | 56.398 |
| 0.8055555555555555 | 56.398 |
| 0.80625 | 56.398 |
| 0.8069444444444445 | 56.398 |
| 0.8076388888888889 | 56.398 |
| 0.8083333333333332 | 56.398 |
| 0.8090277777777778 | 51.951 |
| 0.8097222222222222 | 51.951 |
| 0.8104166666666667 | 51.951 |
| 0.811111111111111 | 51.951 |
| 0.8118055555555556 | 47.511 |
| 0.8125 | 47.511 |
| 0.8131944444444444 | 47.511 |
| 0.813888888888889 | 47.511 |
| 0.8145833333333333 | 43.079 |
| 0.8152777777777778 | 43.079 |
| 0.8159722222222222 | 43.079 |
| 0.8166666666666668 | 43.079 |
| 0.8173611111111111 | 43.079 |
| 0.8180555555555555 | 38.653 |
| 0.81875 | 38.653 |
| 0.8194444444444445 | 38.653 |
| 0.8201388888888889 | 38.653 |
| 0.8208333333333333 | 38.653 |
| 0.8215277777777777 | 38.653 |
| 0.8222222222222223 | 38.653 |
| 0.8229166666666666 | 38.653 |
| 0.8236111111111111 | 34.234 |
| 0.8243055555555556 | 34.234 |
| 0.8250000000000001 | 34.234 |
| 0.8256944444444444 | 29.823 |
| 0.8263888888888888 | 29.823 |
| 0.8270833333333334 | 29.823 |
| 0.8277777777777778 | 29.823 |
| 0.8284722222222222 | 25.419 |
| 0.8291666666666666 | 25.419 |
| 0.8298611111111112 | 25.419 |
| 0.8305555555555556 | 21.024 |
| 0.8312499999999999 | 21.024 |
| 0.8319444444444444 | 21.024 |
| 0.8326388888888889 | 21.024 |
| 0.8333333333333334 | 16.636 |
| 0.8340277777777777 | 16.636 |
| 0.8347222222222223 | 16.636 |
| 0.8354166666666667 | 12.257 |
| 0.8361111111111111 | 12.257 |
| 0.8368055555555555 | 12.257 |
| 0.8375 | 12.257 |
| 0.8381944444444445 | 12.257 |
| 0.8388888888888889 | 12.257 |
| 0.8395833333333332 | 12.257 |
| 0.8402777777777778 | 7.887 |
| 0.8409722222222222 | 7.887 |
| 0.8416666666666667 | 7.887 |
| 0.842361111111111 | 7.887 |
| 0.8430555555555556 | 7.887 |
| 0.84375 | 7.887 |
| 0.8444444444444444 | 3.525 |
| 0.845138888888889 | 3.525 |
| 0.8458333333333333 | 3.525 |
| 0.8465277777777778 | 3.525 |
| 0.8472222222222222 | 3.525 |
| 0.8479166666666668 | 3.525 |
| 0.8486111111111111 | 3.525 |
| 0.8493055555555555 | 3.525 |
| 0.85 | 0 |
| 0.8506944444444445 | 0 |
| 0.8513888888888889 | 0 |
| 0.8520833333333333 | 0 |
| 0.8527777777777777 | 0 |
| 0.8534722222222223 | 0 |
| 0.8541666666666666 | 0 |
| 0.8548611111111111 | 0 |
| 0.8555555555555556 | 0 |
| 0.8562500000000001 | 0 |
| 0.8569444444444444 | 0 |
| 0.8576388888888888 | 0 |
| 0.8583333333333334 | 0 |
| 0.8590277777777778 | 0 |
| 0.8597222222222222 | 0 |
| 0.8604166666666666 | 0 |
| 0.8611111111111112 | 0 |
| 0.8618055555555556 | 0 |
| 0.8624999999999999 | 0 |
| 0.8631944444444444 | 0 |
| 0.8638888888888889 | 0 |
| 0.8645833333333334 | 0 |
| 0.8652777777777777 | 0 |
| 0.8659722222222223 | 0 |
| 0.8666666666666667 | 0 |
| 0.8673611111111111 | 0 |
| 0.8680555555555555 | 0 |
| 0.86875 | 0 |
| 0.8694444444444445 | 0 |
| 0.8701388888888889 | 0 |
| 0.8708333333333332 | 0 |
| 0.8715277777777778 | 0 |
| 0.8722222222222222 | 0 |
| 0.8729166666666667 | 0 |
| 0.873611111111111 | 0 |
| 0.8743055555555556 | 0 |
| 0.875 | 0 |
| 0.8756944444444444 | 0 |
| 0.876388888888889 | 0 |
| 0.8770833333333333 | 0 |
| 0.8777777777777778 | 0 |
| 0.8784722222222222 | 0 |
| 0.8791666666666668 | 0 |
| 0.8798611111111111 | 0 |
| 0.8805555555555555 | 0 |
| 0.88125 | 0 |
| 0.8819444444444445 | 0 |
| 0.8826388888888889 | 0 |
| 0.8833333333333333 | 0 |
| 0.8840277777777777 | 0 |
| 0.8847222222222223 | 0 |
| 0.8854166666666666 | 0 |
| 0.8861111111111111 | 0 |
| 0.8868055555555556 | 0 |
| 0.8875000000000001 | 0 |
| 0.8881944444444444 | 0 |
| 0.8888888888888888 | 0 |
| 0.8895833333333334 | 0 |
| 0.8902777777777778 | 0 |
| 0.8909722222222222 | 0 |
| 0.8916666666666666 | 0 |
| 0.8923611111111112 | 0 |
| 0.8930555555555556 | 0 |
| 0.8937499999999999 | 0 |
| 0.8944444444444444 | 0 |
| 0.8951388888888889 | 0 |
| 0.8958333333333334 | 0 |
| 0.8965277777777777 | 0 |
| 0.8972222222222223 | 0 |
| 0.8979166666666667 | 0 |
| 0.8986111111111111 | 0 |
| 0.8993055555555555 | 0 |
| 0.9 | 0 |
| 0.9006944444444445 | 0 |
| 0.9013888888888889 | 0 |
| 0.9020833333333332 | 0 |
| 0.9027777777777778 | 0 |
| 0.9034722222222222 | 0 |
| 0.9041666666666667 | 0 |
| 0.904861111111111 | 0 |
| 0.9055555555555556 | 0 |
| 0.90625 | 0 |
| 0.9069444444444444 | 0 |
| 0.907638888888889 | 0 |
| 0.9083333333333333 | 0 |
| 0.9090277777777778 | 0 |
| 0.9097222222222222 | 0 |
| 0.9104166666666668 | 0 |
| 0.9111111111111111 | 0 |
| 0.9118055555555555 | 0 |
| 0.9125 | 0 |
| 0.9131944444444445 | 0 |
| 0.9138888888888889 | 0 |
| 0.9145833333333333 | 0 |
| 0.9152777777777777 | 0 |
| 0.9159722222222223 | 0 |
| 0.9166666666666666 | 0 |
| 0.9173611111111111 | 0 |
| 0.9180555555555556 | 0 |
| 0.9187500000000001 | 0 |
| 0.9194444444444444 | 0 |
| 0.9201388888888888 | 0 |
| 0.9208333333333334 | 0 |
| 0.9215277777777778 | 0 |
| 0.9222222222222222 | 0 |
| 0.9229166666666666 | 0 |
| 0.9236111111111112 | 0 |
| 0.9243055555555556 | 0 |
| 0.9249999999999999 | 0 |
| 0.9256944444444444 | 0 |
| 0.9263888888888889 | 0 |
| 0.9270833333333334 | 0 |
| 0.9277777777777777 | 0 |
| 0.9284722222222223 | 0 |
| 0.9291666666666667 | 0 |
| 0.9298611111111111 | 0 |
| 0.9305555555555555 | 0 |
| 0.93125 | 0 |
| 0.9319444444444445 | 0 |
| 0.9326388888888889 | 0 |
| 0.9333333333333332 | 0 |
| 0.9340277777777778 | 0 |
| 0.9347222222222222 | 0 |
| 0.9354166666666667 | 0 |
| 0.936111111111111 | 0 |
| 0.9368055555555556 | 0 |
| 0.9375 | 0 |
| 0.9381944444444444 | 0 |
| 0.938888888888889 | 0 |
| 0.9395833333333333 | 0 |
| 0.9402777777777778 | 0 |
| 0.9409722222222222 | 0 |
| 0.9416666666666668 | 0 |
| 0.9423611111111111 | 0 |
| 0.9430555555555555 | 0 |
| 0.94375 | 0 |
| 0.9444444444444445 | 0 |
| 0.9451388888888889 | 0 |
| 0.9458333333333333 | 0 |
| 0.9465277777777777 | 0 |
| 0.9472222222222223 | 0 |
| 0.9479166666666666 | 0 |
| 0.9486111111111111 | 0 |
| 0.9493055555555556 | 0 |
| 0.9500000000000001 | 0 |
| 0.9506944444444444 | 0 |
| 0.9513888888888888 | 0 |
| 0.9520833333333334 | 0 |
| 0.9527777777777778 | 0 |
| 0.9534722222222222 | 0 |
| 0.9541666666666666 | 0 |
| 0.9548611111111112 | 0 |
| 0.9555555555555556 | 0 |
| 0.9562499999999999 | 0 |
| 0.9569444444444444 | 0 |
| 0.9576388888888889 | 0 |
| 0.9583333333333334 | 0 |
| 0.9590277777777777 | 0 |
| 0.9597222222222223 | 0 |
| 0.9604166666666667 | 0 |
| 0.9611111111111111 | 0 |
| 0.9618055555555555 | 0 |
| 0.9625 | 0 |
| 0.9631944444444445 | 0 |
| 0.9638888888888889 | 0 |
| 0.9645833333333332 | 0 |
| 0.9652777777777778 | 0 |
| 0.9659722222222222 | 0 |
| 0.9666666666666667 | 0 |
| 0.967361111111111 | 0 |
| 0.9680555555555556 | 0 |
| 0.96875 | 0 |
| 0.9694444444444444 | 0 |
| 0.970138888888889 | 0 |
| 0.9708333333333333 | 0 |
| 0.9715277777777778 | 0 |
| 0.9722222222222222 | 0 |
| 0.9729166666666668 | 0 |
| 0.9736111111111111 | 0 |
| 0.9743055555555555 | 0 |
| 0.975 | 0 |
| 0.9756944444444445 | 0 |
| 0.9763888888888889 | 0 |
| 0.9770833333333333 | 0 |
| 0.9777777777777777 | 0 |
| 0.9784722222222223 | 0 |
| 0.9791666666666666 | 0 |
| 0.9798611111111111 | 0 |
| 0.9805555555555556 | 0 |
| 0.9812500000000001 | 0 |
| 0.9819444444444444 | 0 |
| 0.9826388888888888 | 0 |
| 0.9833333333333334 | 0 |
| 0.9840277777777778 | 0 |
| 0.9847222222222222 | 0 |
| 0.9854166666666666 | 0 |
| 0.9861111111111112 | 0 |
| 0.9868055555555556 | 0 |
| 0.9874999999999999 | 0 |
| 0.9881944444444444 | 0 |
| 0.9888888888888889 | 0 |
| 0.9895833333333334 | 0 |
| 0.9902777777777777 | 0 |
| 0.9909722222222223 | 0 |
| 0.9916666666666667 | 0 |
| 0.9923611111111111 | 0 |
| 0.9930555555555555 | 0 |
| 0.99375 | 0 |
| 0.9944444444444445 | 0 |
| 0.9951388888888889 | 0 |
| 0.9958333333333332 | 0 |
| 0.9965277777777778 | 0 |
| 0.9972222222222222 | 0 |
| 0.9979166666666667 | 0 |
| 0.998611111111111 | 0 |
| 0.9993055555555556 | 0 |